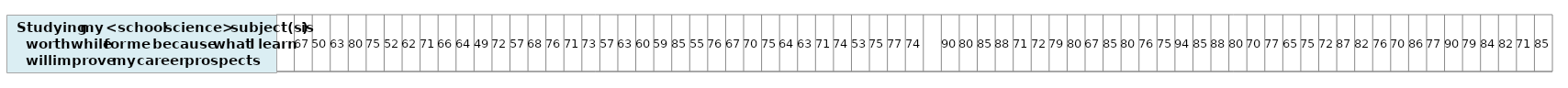
| Category | Studying my <school science> subject(s) is worthwhile for me because what I learn will improve my career prospects |
|---|---|
| nan | 1 |
| 66.72033859759858 | 1 |
| 49.96735607729134 | 1 |
| 63.09091359110786 | 1 |
| 79.51756932925643 | 1 |
| 75.32746699124749 | 1 |
| 51.74404893811847 | 1 |
| 62.02230558135757 | 1 |
| 71.42268942403336 | 1 |
| 65.90752250255386 | 1 |
| 64.01421545454077 | 1 |
| 49.09569513088612 | 1 |
| 72.42041865446943 | 1 |
| 56.70670634650767 | 1 |
| 67.81541005436314 | 1 |
| 76.44165566088526 | 1 |
| 71.39809857415666 | 1 |
| 72.91463233586136 | 1 |
| 56.68064496237505 | 1 |
| 62.66693314202658 | 1 |
| 59.82656065093903 | 1 |
| 58.64772458233416 | 1 |
| 85.02060206657409 | 1 |
| 54.67539334493845 | 1 |
| 75.68187276020281 | 1 |
| 67.10928586200032 | 1 |
| 70.24615767399288 | 1 |
| 75.33853903331496 | 1 |
| 63.52670554706839 | 1 |
| 62.57585179715598 | 1 |
| 70.5080827530499 | 1 |
| 74.09981471543658 | 1 |
| 52.63356075202405 | 1 |
| 74.89895117363274 | 1 |
| 76.99430468041734 | 1 |
| 74.10194947815965 | 1 |
| nan | 1 |
| 90.06581168780946 | 1 |
| 80.16681852772754 | 1 |
| 85.28499235316312 | 1 |
| 87.82310345804302 | 1 |
| 71.46379700401903 | 1 |
| 71.77203239637696 | 1 |
| 79.26951384118435 | 1 |
| 80.38519653987657 | 1 |
| 67.2797447493919 | 1 |
| 84.6543828416067 | 1 |
| 79.70991038838771 | 1 |
| 75.54775955645663 | 1 |
| 75.29988943583122 | 1 |
| 93.59379694476048 | 1 |
| 84.82015607386181 | 1 |
| 88.3774224375436 | 1 |
| 80.19908662411804 | 1 |
| 69.99664353343559 | 1 |
| 76.54965721656384 | 1 |
| 65.08908094165837 | 1 |
| 74.9756147483724 | 1 |
| 72.05464263182063 | 1 |
| 86.71078936246825 | 1 |
| 81.61640885423657 | 1 |
| 76.27026310447548 | 1 |
| 69.64202037283052 | 1 |
| 85.86551847767538 | 1 |
| 76.71529518788324 | 1 |
| 90.0330018995364 | 1 |
| 78.94355107963025 | 1 |
| 84.2499033629874 | 1 |
| 82.43049336890269 | 1 |
| 71.44521045223266 | 1 |
| 85.17005178290621 | 1 |